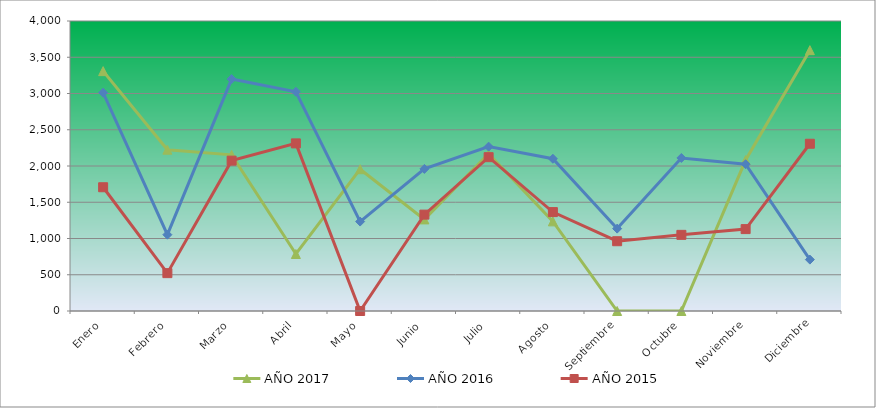
| Category | AÑO 2017 | AÑO 2016 | AÑO 2015 |
|---|---|---|---|
| Enero | 3308.613 | 3011.746 | 1706.99 |
| Febrero | 2224.933 | 1052.642 | 522.231 |
| Marzo | 2153.515 | 3199.122 | 2073.913 |
| Abril | 786.192 | 3023.536 | 2311.897 |
| Mayo | 1955.743 | 1233.518 | 0 |
| Junio | 1263.542 | 1959.99 | 1329.431 |
| Julio | 2169.996 | 2266.984 | 2121.773 |
| Agosto | 1236.303 | 2100.056 | 1364.254 |
| Septiembre | 0 | 1136.184 | 962.313 |
| Octubre | 0 | 2110.826 | 1050.329 |
| Noviembre | 2082.098 | 2024.67 | 1129.544 |
| Diciembre | 3597.561 | 708.68 | 2306.967 |